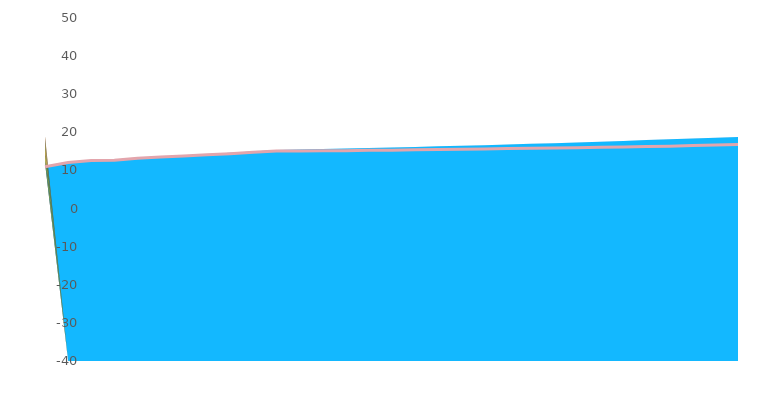
| Category | Western Europe Ref |
|---|---|
| 2020.0 | 10.996 |
| 2021.0 | 12.062 |
| 2022.0 | 12.585 |
| 2023.0 | 12.661 |
| 2024.0 | 13.188 |
| 2025.0 | 13.559 |
| 2026.0 | 13.798 |
| 2027.0 | 14.106 |
| 2028.0 | 14.406 |
| 2029.0 | 14.742 |
| 2030.0 | 15.109 |
| 2031.0 | 15.119 |
| 2032.0 | 15.14 |
| 2033.0 | 15.184 |
| 2034.0 | 15.273 |
| 2035.0 | 15.322 |
| 2036.0 | 15.418 |
| 2037.0 | 15.478 |
| 2038.0 | 15.578 |
| 2039.0 | 15.644 |
| 2040.0 | 15.731 |
| 2041.0 | 15.796 |
| 2042.0 | 15.88 |
| 2043.0 | 15.954 |
| 2044.0 | 16.077 |
| 2045.0 | 16.162 |
| 2046.0 | 16.258 |
| 2047.0 | 16.38 |
| 2048.0 | 16.538 |
| 2049.0 | 16.651 |
| 2050.0 | 16.797 |